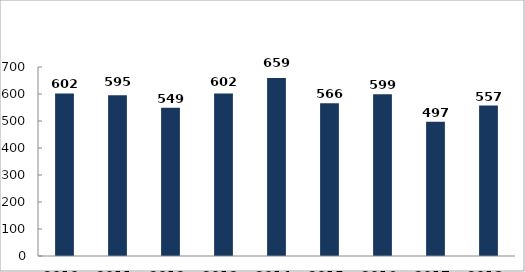
| Category | Bűncselekmény gyanúja miatti előállítások száma |
|---|---|
| 2010. év | 602 |
| 2011. év | 595 |
| 2012. év | 549 |
| 2013. év | 602 |
| 2014. év | 659 |
| 2015. év | 566 |
| 2016. év | 599 |
| 2017. év | 497 |
| 2018. év | 557 |